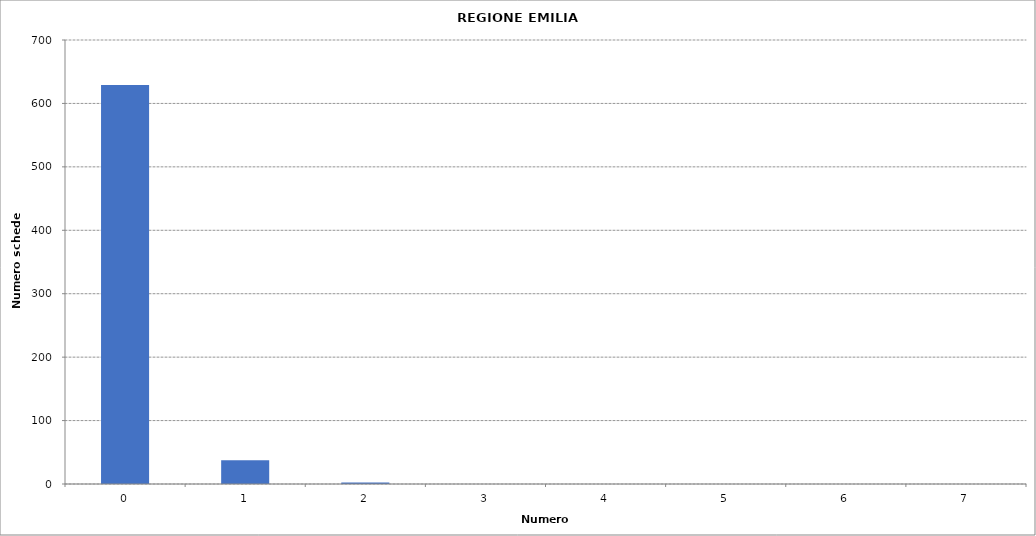
| Category | Series 0 |
|---|---|
| 0.0 | 629007 |
| 1.0 | 37358 |
| 2.0 | 2554 |
| 3.0 | 152 |
| 4.0 | 48 |
| 5.0 | 14 |
| 6.0 | 4 |
| 7.0 | 1 |